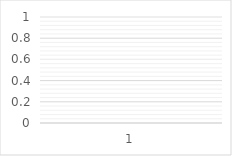
| Category | AUDIT SYSTÈME  |
|---|---|
| 0 | 0 |